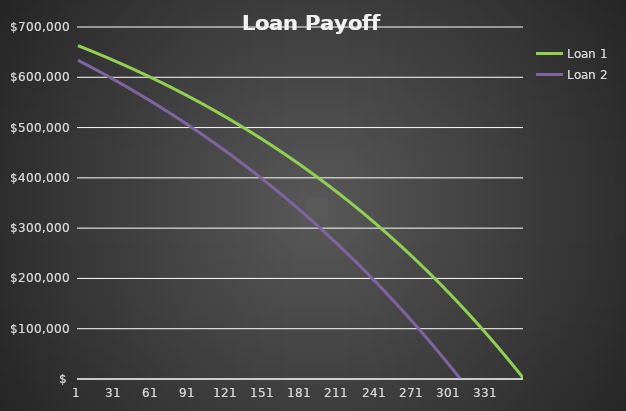
| Category | Loan 1 | Loan 2 |
|---|---|---|
| 1.0 | 662941.91 | 633730.08 |
| 2.0 | 661960.662 | 632456.455 |
| 3.0 | 660976.245 | 631179.116 |
| 4.0 | 659988.65 | 629898.051 |
| 5.0 | 658997.865 | 628613.25 |
| 6.0 | 658003.881 | 627324.702 |
| 7.0 | 657006.687 | 626032.395 |
| 8.0 | 656006.273 | 624736.319 |
| 9.0 | 655002.629 | 623436.463 |
| 10.0 | 653995.743 | 622132.816 |
| 11.0 | 652985.607 | 620825.366 |
| 12.0 | 651972.208 | 619514.103 |
| 13.0 | 650955.537 | 618199.015 |
| 14.0 | 649935.583 | 616880.092 |
| 15.0 | 648912.335 | 615557.322 |
| 16.0 | 647885.783 | 614230.693 |
| 17.0 | 646855.916 | 612900.196 |
| 18.0 | 645822.724 | 611565.818 |
| 19.0 | 644786.195 | 610227.547 |
| 20.0 | 643746.319 | 608885.374 |
| 21.0 | 642703.085 | 607539.286 |
| 22.0 | 641656.482 | 606189.272 |
| 23.0 | 640606.5 | 604835.32 |
| 24.0 | 639553.127 | 603477.419 |
| 25.0 | 638496.353 | 602115.558 |
| 26.0 | 637436.166 | 600749.725 |
| 27.0 | 636372.555 | 599379.908 |
| 28.0 | 635305.51 | 598006.095 |
| 29.0 | 634235.02 | 596628.276 |
| 30.0 | 633161.072 | 595246.438 |
| 31.0 | 632083.657 | 593860.57 |
| 32.0 | 631002.762 | 592470.659 |
| 33.0 | 629918.377 | 591076.695 |
| 34.0 | 628830.491 | 589678.665 |
| 35.0 | 627739.091 | 588276.557 |
| 36.0 | 626644.167 | 586870.36 |
| 37.0 | 625545.707 | 585460.061 |
| 38.0 | 624443.701 | 584045.649 |
| 39.0 | 623338.136 | 582627.112 |
| 40.0 | 622229 | 581204.437 |
| 41.0 | 621116.283 | 579777.613 |
| 42.0 | 619999.973 | 578346.628 |
| 43.0 | 618880.058 | 576911.468 |
| 44.0 | 617756.527 | 575472.123 |
| 45.0 | 616629.368 | 574028.579 |
| 46.0 | 615498.569 | 572580.826 |
| 47.0 | 614364.118 | 571128.849 |
| 48.0 | 613226.004 | 569672.638 |
| 49.0 | 612084.215 | 568212.179 |
| 50.0 | 610938.739 | 566747.461 |
| 51.0 | 609789.564 | 565278.471 |
| 52.0 | 608636.678 | 563805.196 |
| 53.0 | 607480.07 | 562327.624 |
| 54.0 | 606319.726 | 560845.742 |
| 55.0 | 605155.635 | 559359.539 |
| 56.0 | 603987.786 | 557869 |
| 57.0 | 602816.165 | 556374.114 |
| 58.0 | 601640.761 | 554874.869 |
| 59.0 | 600461.561 | 553371.25 |
| 60.0 | 599278.553 | 551863.246 |
| 61.0 | 598091.726 | 550350.843 |
| 62.0 | 596901.065 | 548834.029 |
| 63.0 | 595706.56 | 547312.791 |
| 64.0 | 594508.198 | 545787.116 |
| 65.0 | 593305.966 | 544256.992 |
| 66.0 | 592099.852 | 542722.404 |
| 67.0 | 590889.843 | 541183.341 |
| 68.0 | 589675.927 | 539639.788 |
| 69.0 | 588458.09 | 538091.734 |
| 70.0 | 587236.322 | 536539.165 |
| 71.0 | 586010.608 | 534982.067 |
| 72.0 | 584780.935 | 533420.427 |
| 73.0 | 583547.293 | 531854.233 |
| 74.0 | 582309.666 | 530283.471 |
| 75.0 | 581068.043 | 528708.127 |
| 76.0 | 579822.41 | 527128.189 |
| 77.0 | 578572.756 | 525543.642 |
| 78.0 | 577319.065 | 523954.474 |
| 79.0 | 576061.327 | 522360.671 |
| 80.0 | 574799.527 | 520762.219 |
| 81.0 | 573533.652 | 519159.105 |
| 82.0 | 572263.69 | 517551.315 |
| 83.0 | 570989.627 | 515938.836 |
| 84.0 | 569711.449 | 514321.654 |
| 85.0 | 568429.144 | 512699.755 |
| 86.0 | 567142.699 | 511073.126 |
| 87.0 | 565852.099 | 509441.752 |
| 88.0 | 564557.332 | 507805.62 |
| 89.0 | 563258.383 | 506164.716 |
| 90.0 | 561955.241 | 504519.026 |
| 91.0 | 560647.89 | 502868.536 |
| 92.0 | 559336.317 | 501213.232 |
| 93.0 | 558020.509 | 499553.1 |
| 94.0 | 556700.452 | 497888.126 |
| 95.0 | 555376.133 | 496218.296 |
| 96.0 | 554047.537 | 494543.596 |
| 97.0 | 552714.651 | 492864.011 |
| 98.0 | 551377.46 | 491179.527 |
| 99.0 | 550035.952 | 489490.13 |
| 100.0 | 548690.112 | 487795.806 |
| 101.0 | 547339.926 | 486096.54 |
| 102.0 | 545985.379 | 484392.318 |
| 103.0 | 544626.459 | 482683.125 |
| 104.0 | 543263.151 | 480968.947 |
| 105.0 | 541895.44 | 479249.769 |
| 106.0 | 540523.313 | 477525.577 |
| 107.0 | 539146.754 | 475796.357 |
| 108.0 | 537765.751 | 474062.092 |
| 109.0 | 536380.288 | 472322.77 |
| 110.0 | 534990.352 | 470578.374 |
| 111.0 | 533595.927 | 468828.89 |
| 112.0 | 532196.999 | 467074.304 |
| 113.0 | 530793.553 | 465314.6 |
| 114.0 | 529385.576 | 463549.764 |
| 115.0 | 527973.052 | 461779.781 |
| 116.0 | 526555.967 | 460004.635 |
| 117.0 | 525134.306 | 458224.311 |
| 118.0 | 523708.054 | 456438.795 |
| 119.0 | 522277.197 | 454648.071 |
| 120.0 | 520841.719 | 452852.124 |
| 121.0 | 519401.606 | 451050.939 |
| 122.0 | 517956.842 | 449244.5 |
| 123.0 | 516507.413 | 447432.793 |
| 124.0 | 515053.303 | 445615.802 |
| 125.0 | 513594.498 | 443793.511 |
| 126.0 | 512130.983 | 441965.905 |
| 127.0 | 510662.741 | 440132.968 |
| 128.0 | 509189.758 | 438294.685 |
| 129.0 | 507712.018 | 436451.041 |
| 130.0 | 506229.507 | 434602.02 |
| 131.0 | 504742.208 | 432747.605 |
| 132.0 | 503250.107 | 430887.782 |
| 133.0 | 501753.188 | 429022.534 |
| 134.0 | 500251.434 | 427151.846 |
| 135.0 | 498744.831 | 425275.702 |
| 136.0 | 497233.364 | 423394.085 |
| 137.0 | 495717.015 | 421506.981 |
| 138.0 | 494195.77 | 419614.373 |
| 139.0 | 492669.612 | 417716.244 |
| 140.0 | 491138.526 | 415812.579 |
| 141.0 | 489602.497 | 413903.362 |
| 142.0 | 488061.507 | 411988.577 |
| 143.0 | 486515.54 | 410068.206 |
| 144.0 | 484964.582 | 408142.235 |
| 145.0 | 483408.616 | 406210.646 |
| 146.0 | 481847.625 | 404273.423 |
| 147.0 | 480281.593 | 402330.55 |
| 148.0 | 478710.504 | 400382.011 |
| 149.0 | 477134.342 | 398427.788 |
| 150.0 | 475553.09 | 396467.865 |
| 151.0 | 473966.732 | 394502.226 |
| 152.0 | 472375.252 | 392530.854 |
| 153.0 | 470778.632 | 390553.731 |
| 154.0 | 469176.857 | 388570.843 |
| 155.0 | 467569.909 | 386582.171 |
| 156.0 | 465957.772 | 384587.698 |
| 157.0 | 464340.429 | 382587.409 |
| 158.0 | 462717.864 | 380581.285 |
| 159.0 | 461090.059 | 378569.31 |
| 160.0 | 459456.998 | 376551.466 |
| 161.0 | 457818.663 | 374527.738 |
| 162.0 | 456175.038 | 372498.107 |
| 163.0 | 454526.105 | 370462.556 |
| 164.0 | 452871.847 | 368421.068 |
| 165.0 | 451212.248 | 366373.625 |
| 166.0 | 449547.289 | 364320.211 |
| 167.0 | 447876.955 | 362260.808 |
| 168.0 | 446201.226 | 360195.398 |
| 169.0 | 444520.086 | 358123.964 |
| 170.0 | 442833.517 | 356046.489 |
| 171.0 | 441141.502 | 353962.954 |
| 172.0 | 439444.024 | 351873.342 |
| 173.0 | 437741.064 | 349777.636 |
| 174.0 | 436032.605 | 347675.817 |
| 175.0 | 434318.629 | 345567.867 |
| 176.0 | 432599.118 | 343453.77 |
| 177.0 | 430874.054 | 341333.506 |
| 178.0 | 429143.42 | 339207.059 |
| 179.0 | 427407.198 | 337074.409 |
| 180.0 | 425665.369 | 334935.539 |
| 181.0 | 423917.915 | 332790.43 |
| 182.0 | 422164.819 | 330639.065 |
| 183.0 | 420406.061 | 328481.425 |
| 184.0 | 418641.625 | 326317.493 |
| 185.0 | 416871.49 | 324147.248 |
| 186.0 | 415095.64 | 321970.674 |
| 187.0 | 413314.055 | 319787.751 |
| 188.0 | 411526.717 | 317598.462 |
| 189.0 | 409733.607 | 315402.787 |
| 190.0 | 407934.707 | 313200.708 |
| 191.0 | 406129.998 | 310992.206 |
| 192.0 | 404319.461 | 308777.263 |
| 193.0 | 402503.078 | 306555.86 |
| 194.0 | 400680.83 | 304327.977 |
| 195.0 | 398852.697 | 302093.596 |
| 196.0 | 397018.661 | 299852.699 |
| 197.0 | 395178.702 | 297605.266 |
| 198.0 | 393332.802 | 295351.277 |
| 199.0 | 391480.941 | 293090.715 |
| 200.0 | 389623.1 | 290823.559 |
| 201.0 | 387759.26 | 288549.79 |
| 202.0 | 385889.401 | 286269.39 |
| 203.0 | 384013.504 | 283982.339 |
| 204.0 | 382131.55 | 281688.617 |
| 205.0 | 380243.518 | 279388.205 |
| 206.0 | 378349.39 | 277081.083 |
| 207.0 | 376449.145 | 274767.233 |
| 208.0 | 374542.764 | 272446.634 |
| 209.0 | 372630.227 | 270119.266 |
| 210.0 | 370711.514 | 267785.11 |
| 211.0 | 368786.605 | 265444.146 |
| 212.0 | 366855.481 | 263096.354 |
| 213.0 | 364918.12 | 260741.715 |
| 214.0 | 362974.504 | 258380.208 |
| 215.0 | 361024.611 | 256011.813 |
| 216.0 | 359068.421 | 253636.51 |
| 217.0 | 357105.915 | 251254.28 |
| 218.0 | 355137.072 | 248865.101 |
| 219.0 | 353161.87 | 246468.954 |
| 220.0 | 351180.291 | 244065.818 |
| 221.0 | 349192.312 | 241655.673 |
| 222.0 | 347197.915 | 239238.498 |
| 223.0 | 345197.076 | 236814.273 |
| 224.0 | 343189.777 | 234382.978 |
| 225.0 | 341175.996 | 231944.591 |
| 226.0 | 339155.712 | 229499.092 |
| 227.0 | 337128.905 | 227046.461 |
| 228.0 | 335095.552 | 224586.676 |
| 229.0 | 333055.633 | 222119.716 |
| 230.0 | 331009.127 | 219645.562 |
| 231.0 | 328956.013 | 217164.191 |
| 232.0 | 326896.269 | 214675.583 |
| 233.0 | 324829.873 | 212179.716 |
| 234.0 | 322756.805 | 209676.57 |
| 235.0 | 320677.043 | 207166.123 |
| 236.0 | 318590.564 | 204648.354 |
| 237.0 | 316497.348 | 202123.241 |
| 238.0 | 314397.373 | 199590.763 |
| 239.0 | 312290.616 | 197050.899 |
| 240.0 | 310177.057 | 194503.627 |
| 241.0 | 308056.672 | 191948.926 |
| 242.0 | 305929.44 | 189386.773 |
| 243.0 | 303795.339 | 186817.147 |
| 244.0 | 301654.347 | 184240.027 |
| 245.0 | 299506.441 | 181655.39 |
| 246.0 | 297351.599 | 179063.214 |
| 247.0 | 295189.799 | 176463.478 |
| 248.0 | 293021.018 | 173856.16 |
| 249.0 | 290845.234 | 171241.236 |
| 250.0 | 288662.424 | 168618.686 |
| 251.0 | 286472.565 | 165988.487 |
| 252.0 | 284275.634 | 163350.616 |
| 253.0 | 282071.61 | 160705.052 |
| 254.0 | 279860.468 | 158051.771 |
| 255.0 | 277642.186 | 155390.752 |
| 256.0 | 275416.741 | 152721.971 |
| 257.0 | 273184.109 | 150045.406 |
| 258.0 | 270944.268 | 147361.035 |
| 259.0 | 268697.194 | 144668.834 |
| 260.0 | 266442.864 | 141968.781 |
| 261.0 | 264181.255 | 139260.853 |
| 262.0 | 261912.342 | 136545.027 |
| 263.0 | 259636.102 | 133821.279 |
| 264.0 | 257352.513 | 131089.587 |
| 265.0 | 255061.549 | 128349.928 |
| 266.0 | 252763.187 | 125602.278 |
| 267.0 | 250457.403 | 122846.615 |
| 268.0 | 248144.174 | 120082.914 |
| 269.0 | 245823.475 | 117311.152 |
| 270.0 | 243495.282 | 114531.305 |
| 271.0 | 241159.571 | 111743.351 |
| 272.0 | 238816.317 | 108947.266 |
| 273.0 | 236465.497 | 106143.025 |
| 274.0 | 234107.085 | 103330.605 |
| 275.0 | 231741.058 | 100509.982 |
| 276.0 | 229367.39 | 97681.132 |
| 277.0 | 226986.058 | 94844.032 |
| 278.0 | 224597.035 | 91998.656 |
| 279.0 | 222200.299 | 89144.982 |
| 280.0 | 219795.822 | 86282.985 |
| 281.0 | 217383.582 | 83412.639 |
| 282.0 | 214963.552 | 80533.923 |
| 283.0 | 212535.707 | 77646.809 |
| 284.0 | 210100.022 | 74751.275 |
| 285.0 | 207656.472 | 71847.296 |
| 286.0 | 205205.031 | 68934.847 |
| 287.0 | 202745.674 | 66013.903 |
| 288.0 | 200278.376 | 63084.44 |
| 289.0 | 197803.11 | 60146.433 |
| 290.0 | 195319.851 | 57199.856 |
| 291.0 | 192828.573 | 54244.685 |
| 292.0 | 190329.251 | 51280.895 |
| 293.0 | 187821.858 | 48308.46 |
| 294.0 | 185306.368 | 45327.356 |
| 295.0 | 182782.755 | 42337.557 |
| 296.0 | 180250.993 | 39339.038 |
| 297.0 | 177711.055 | 36331.773 |
| 298.0 | 175162.916 | 33315.737 |
| 299.0 | 172606.548 | 30290.904 |
| 300.0 | 170041.925 | 27257.249 |
| 301.0 | 167469.021 | 24214.746 |
| 302.0 | 164887.808 | 21163.368 |
| 303.0 | 162298.261 | 18103.091 |
| 304.0 | 159700.351 | 15033.888 |
| 305.0 | 157094.052 | 11955.733 |
| 306.0 | 154479.336 | 8868.6 |
| 307.0 | 151856.178 | 5772.463 |
| 308.0 | 149224.549 | 2667.296 |
| 309.0 | 146584.422 | -446.929 |
| 310.0 | 143935.769 | -3570.236 |
| 311.0 | 141278.564 | -6702.653 |
| 312.0 | 138612.778 | -9844.206 |
| 313.0 | 135938.383 | -12994.922 |
| 314.0 | 133255.353 | -16154.828 |
| 315.0 | 130563.659 | -19323.95 |
| 316.0 | 127863.272 | -22502.315 |
| 317.0 | 125154.166 | -25689.951 |
| 318.0 | 122436.312 | -28886.883 |
| 319.0 | 119709.681 | -32093.141 |
| 320.0 | 116974.246 | -35308.749 |
| 321.0 | 114229.977 | -38533.737 |
| 322.0 | 111476.846 | -41768.131 |
| 323.0 | 108714.826 | -45011.958 |
| 324.0 | 105943.886 | -48265.247 |
| 325.0 | 103163.998 | -51528.024 |
| 326.0 | 100375.134 | -54800.318 |
| 327.0 | 97577.264 | -58082.156 |
| 328.0 | 94770.359 | -61373.566 |
| 329.0 | 91954.39 | -64674.576 |
| 330.0 | 89129.328 | -67985.214 |
| 331.0 | 86295.144 | -71305.508 |
| 332.0 | 83451.807 | -74635.486 |
| 333.0 | 80599.289 | -77975.177 |
| 334.0 | 77737.559 | -81324.608 |
| 335.0 | 74866.589 | -84683.809 |
| 336.0 | 71986.348 | -88052.807 |
| 337.0 | 69096.805 | -91431.631 |
| 338.0 | 66197.933 | -94820.311 |
| 339.0 | 63289.699 | -98218.874 |
| 340.0 | 60372.074 | -101627.349 |
| 341.0 | 57445.027 | -105045.766 |
| 342.0 | 54508.529 | -108474.153 |
| 343.0 | 51562.548 | -111912.54 |
| 344.0 | 48607.054 | -115360.955 |
| 345.0 | 45642.016 | -118819.429 |
| 346.0 | 42667.404 | -122287.989 |
| 347.0 | 39683.186 | -125766.666 |
| 348.0 | 36689.331 | -129255.489 |
| 349.0 | 33685.809 | -132754.488 |
| 350.0 | 30672.588 | -136263.693 |
| 351.0 | 27649.637 | -139783.132 |
| 352.0 | 24616.924 | -143312.837 |
| 353.0 | 21574.418 | -146852.836 |
| 354.0 | 18522.088 | -150403.161 |
| 355.0 | 15459.901 | -153963.841 |
| 356.0 | 12387.825 | -157534.906 |
| 357.0 | 9305.829 | -161116.386 |
| 358.0 | 6213.881 | -164708.313 |
| 359.0 | 3111.949 | -168310.716 |
| 360.0 | 0 | -171923.626 |